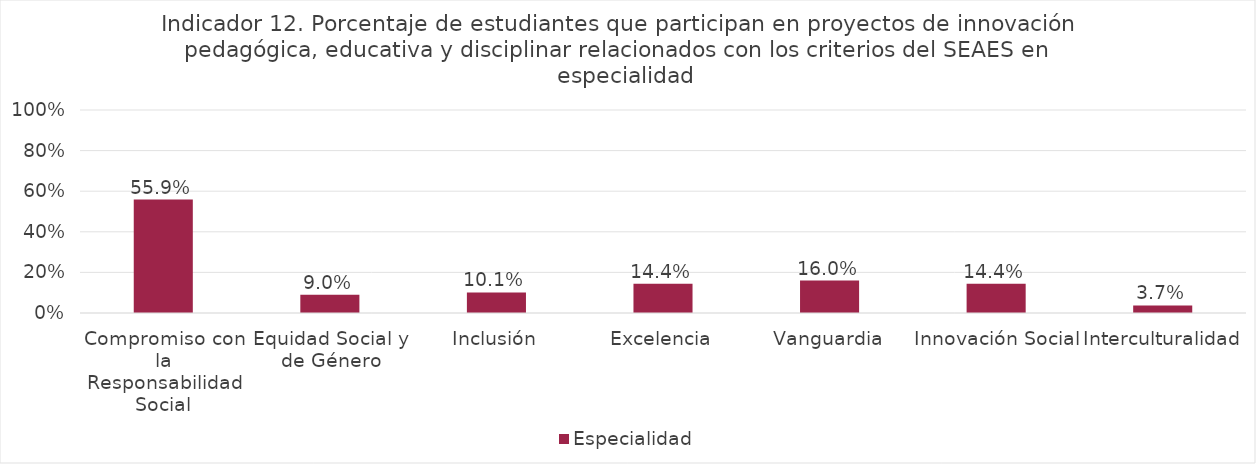
| Category | Especialidad |
|---|---|
| Compromiso con la Responsabilidad Social | 0.559 |
| Equidad Social y de Género | 0.09 |
| Inclusión | 0.101 |
| Excelencia | 0.144 |
| Vanguardia | 0.16 |
| Innovación Social | 0.144 |
| Interculturalidad | 0.037 |